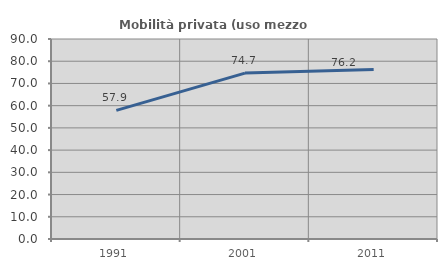
| Category | Mobilità privata (uso mezzo privato) |
|---|---|
| 1991.0 | 57.862 |
| 2001.0 | 74.664 |
| 2011.0 | 76.23 |